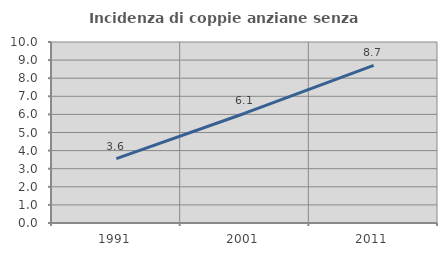
| Category | Incidenza di coppie anziane senza figli  |
|---|---|
| 1991.0 | 3.552 |
| 2001.0 | 6.065 |
| 2011.0 | 8.707 |